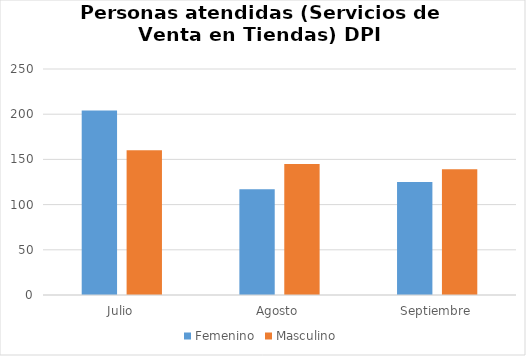
| Category | Femenino | Masculino |
|---|---|---|
| Julio | 204 | 160 |
| Agosto | 117 | 145 |
| Septiembre | 125 | 139 |